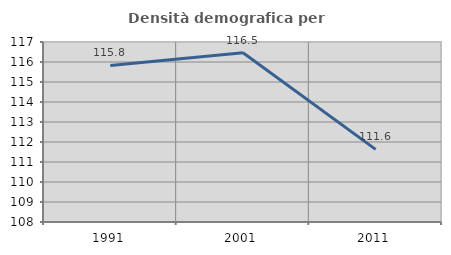
| Category | Densità demografica |
|---|---|
| 1991.0 | 115.828 |
| 2001.0 | 116.463 |
| 2011.0 | 111.632 |